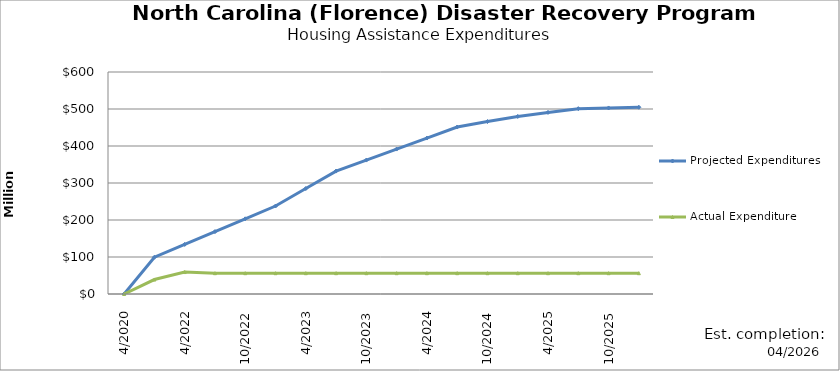
| Category | Projected Expenditures | Actual Expenditure |
|---|---|---|
| 4/2020 | 0 | 0 |
| 1/2022 | 99439513 | 39075931.48 |
| 4/2022 | 134033068 | 59337640.48 |
| 7/2022 | 168626623 | 56216939.04 |
| 10/2022 | 203220178 | 56216939.04 |
| 1/2023 | 237813733 | 56216939.04 |
| 4/2023 | 285019896 | 56216939.04 |
| 7/2023 | 332226060 | 56216939.04 |
| 10/2023 | 361986192 | 56216939.04 |
| 1/2024 | 391746324 | 56216939.04 |
| 4/2024 | 421506456 | 56216939.04 |
| 7/2024 | 451266588 | 56216939.04 |
| 10/2024 | 466104010 | 56216939.04 |
| 1/2025 | 479856144 | 56216939.04 |
| 4/2025 | 490821498 | 56216939.04 |
| 7/2025 | 500860412 | 56216939.04 |
| 10/2025 | 502759666 | 56216939.04 |
| 1/2026 | 504658920 | 56216939.04 |